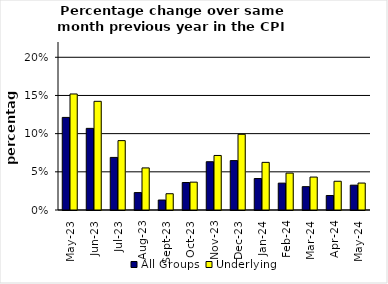
| Category | All Groups | Underlying |
|---|---|---|
| 2023-05-01 | 0.121 | 0.152 |
| 2023-06-01 | 0.107 | 0.142 |
| 2023-07-01 | 0.069 | 0.091 |
| 2023-08-01 | 0.023 | 0.055 |
| 2023-09-01 | 0.013 | 0.021 |
| 2023-10-01 | 0.036 | 0.036 |
| 2023-11-01 | 0.063 | 0.071 |
| 2023-12-01 | 0.065 | 0.099 |
| 2024-01-01 | 0.041 | 0.062 |
| 2024-02-01 | 0.035 | 0.048 |
| 2024-03-01 | 0.031 | 0.043 |
| 2024-04-01 | 0.019 | 0.038 |
| 2024-05-01 | 0.033 | 0.035 |